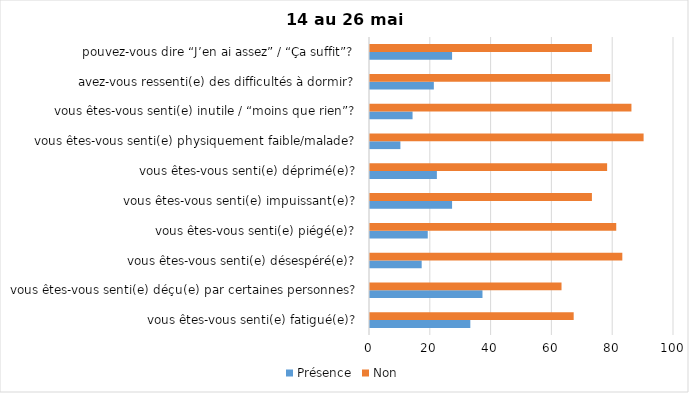
| Category | Présence | Non |
|---|---|---|
| vous êtes-vous senti(e) fatigué(e)? | 33 | 67 |
| vous êtes-vous senti(e) déçu(e) par certaines personnes? | 37 | 63 |
| vous êtes-vous senti(e) désespéré(e)? | 17 | 83 |
| vous êtes-vous senti(e) piégé(e)? | 19 | 81 |
| vous êtes-vous senti(e) impuissant(e)? | 27 | 73 |
| vous êtes-vous senti(e) déprimé(e)? | 22 | 78 |
| vous êtes-vous senti(e) physiquement faible/malade? | 10 | 90 |
| vous êtes-vous senti(e) inutile / “moins que rien”? | 14 | 86 |
| avez-vous ressenti(e) des difficultés à dormir? | 21 | 79 |
| pouvez-vous dire “J’en ai assez” / “Ça suffit”? | 27 | 73 |